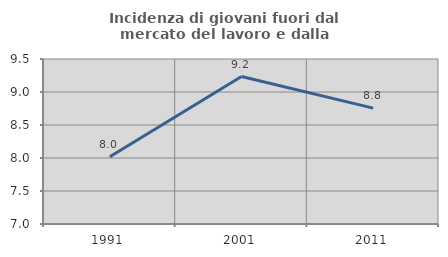
| Category | Incidenza di giovani fuori dal mercato del lavoro e dalla formazione  |
|---|---|
| 1991.0 | 8.02 |
| 2001.0 | 9.234 |
| 2011.0 | 8.756 |